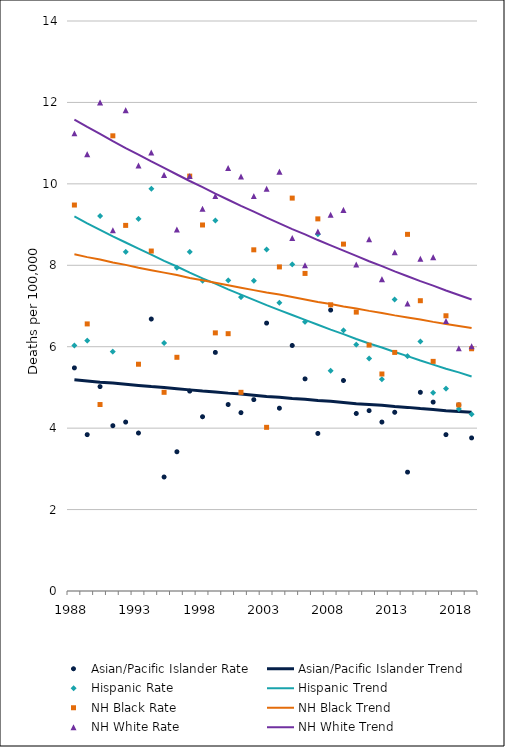
| Category | Asian/Pacific Islander Rate | Asian/Pacific Islander Trend | Hispanic Rate | Hispanic Trend | NH Black Rate | NH Black Trend | NH White Rate | NH White Trend |
|---|---|---|---|---|---|---|---|---|
| 1988.0 | 5.48 | 5.19 | 6.03 | 9.2 | 9.48 | 8.27 | 11.24 | 11.58 |
| 1989.0 | 3.84 | 5.16 | 6.15 | 9.03 | 6.56 | 8.2 | 10.73 | 11.4 |
| 1990.0 | 5.02 | 5.13 | 9.21 | 8.87 | 4.58 | 8.14 | 12 | 11.23 |
| 1991.0 | 4.06 | 5.11 | 5.88 | 8.71 | 11.18 | 8.07 | 8.86 | 11.05 |
| 1992.0 | 4.15 | 5.08 | 8.33 | 8.56 | 8.98 | 8.01 | 11.81 | 10.88 |
| 1993.0 | 3.88 | 5.05 | 9.14 | 8.41 | 5.57 | 7.94 | 10.45 | 10.72 |
| 1994.0 | 6.68 | 5.02 | 9.88 | 8.26 | 8.35 | 7.88 | 10.77 | 10.55 |
| 1995.0 | 2.8 | 5 | 6.09 | 8.11 | 4.88 | 7.82 | 10.22 | 10.39 |
| 1996.0 | 3.42 | 4.97 | 7.94 | 7.97 | 5.74 | 7.76 | 8.88 | 10.23 |
| 1997.0 | 4.91 | 4.94 | 8.33 | 7.82 | 10.19 | 7.69 | 10.19 | 10.07 |
| 1998.0 | 4.28 | 4.91 | 7.62 | 7.68 | 8.99 | 7.63 | 9.39 | 9.92 |
| 1999.0 | 5.86 | 4.89 | 9.1 | 7.55 | 6.34 | 7.57 | 9.7 | 9.76 |
| 2000.0 | 4.58 | 4.86 | 7.63 | 7.41 | 6.32 | 7.51 | 10.39 | 9.61 |
| 2001.0 | 4.38 | 4.84 | 7.22 | 7.28 | 4.88 | 7.45 | 10.18 | 9.46 |
| 2002.0 | 4.7 | 4.81 | 7.62 | 7.15 | 8.38 | 7.39 | 9.7 | 9.32 |
| 2003.0 | 6.58 | 4.78 | 8.39 | 7.02 | 4.02 | 7.33 | 9.88 | 9.17 |
| 2004.0 | 4.49 | 4.76 | 7.08 | 6.9 | 7.96 | 7.28 | 10.3 | 9.03 |
| 2005.0 | 6.03 | 4.73 | 8.02 | 6.78 | 9.65 | 7.22 | 8.67 | 8.89 |
| 2006.0 | 5.21 | 4.71 | 6.61 | 6.66 | 7.8 | 7.16 | 8 | 8.76 |
| 2007.0 | 3.87 | 4.68 | 8.76 | 6.54 | 9.14 | 7.1 | 8.83 | 8.62 |
| 2008.0 | 6.9 | 4.66 | 5.41 | 6.42 | 7.03 | 7.05 | 9.24 | 8.49 |
| 2009.0 | 5.17 | 4.63 | 6.4 | 6.31 | 8.52 | 6.99 | 9.36 | 8.36 |
| 2010.0 | 4.36 | 4.6 | 6.05 | 6.19 | 6.85 | 6.94 | 8.02 | 8.23 |
| 2011.0 | 4.43 | 4.58 | 5.71 | 6.08 | 6.04 | 6.88 | 8.64 | 8.1 |
| 2012.0 | 4.15 | 4.56 | 5.2 | 5.98 | 5.33 | 6.83 | 7.66 | 7.98 |
| 2013.0 | 4.39 | 4.53 | 7.16 | 5.87 | 5.86 | 6.77 | 8.32 | 7.85 |
| 2014.0 | 2.92 | 4.51 | 5.77 | 5.77 | 8.76 | 6.72 | 7.06 | 7.73 |
| 2015.0 | 4.88 | 4.48 | 6.13 | 5.66 | 7.13 | 6.67 | 8.16 | 7.61 |
| 2016.0 | 4.64 | 4.46 | 4.87 | 5.56 | 5.64 | 6.61 | 8.2 | 7.5 |
| 2017.0 | 3.84 | 4.43 | 4.97 | 5.46 | 6.76 | 6.56 | 6.63 | 7.38 |
| 2018.0 | 4.57 | 4.41 | 4.47 | 5.37 | 4.57 | 6.51 | 5.96 | 7.27 |
| 2019.0 | 3.76 | 4.39 | 4.34 | 5.27 | 5.95 | 6.46 | 6.01 | 7.16 |